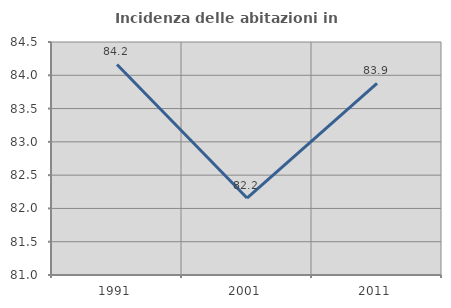
| Category | Incidenza delle abitazioni in proprietà  |
|---|---|
| 1991.0 | 84.162 |
| 2001.0 | 82.155 |
| 2011.0 | 83.877 |